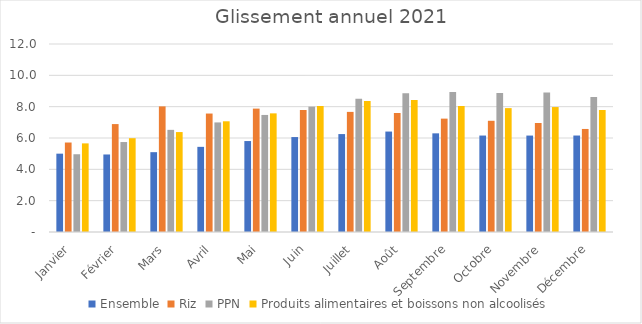
| Category | Ensemble | Riz | PPN | Produits alimentaires et boissons non alcoolisés |
|---|---|---|---|---|
| Janvier | 5 | 5.712 | 4.963 | 5.657 |
| Février | 4.948 | 6.888 | 5.742 | 5.988 |
| Mars | 5.096 | 8.018 | 6.52 | 6.379 |
| Avril | 5.435 | 7.561 | 6.994 | 7.067 |
| Mai | 5.806 | 7.876 | 7.471 | 7.573 |
| Juin | 6.06 | 7.789 | 8.002 | 8.041 |
| Juillet | 6.251 | 7.667 | 8.499 | 8.356 |
| Août | 6.411 | 7.597 | 8.863 | 8.428 |
| Septembre | 6.297 | 7.236 | 8.939 | 8.042 |
| Octobre | 6.157 | 7.099 | 8.878 | 7.907 |
| Novembre | 6.155 | 6.957 | 8.904 | 7.975 |
| Décembre | 6.158 | 6.577 | 8.617 | 7.788 |